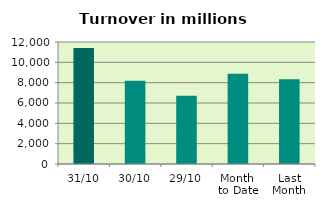
| Category | Series 0 |
|---|---|
| 31/10 | 11421.647 |
| 30/10 | 8200.262 |
| 29/10 | 6719 |
| Month 
to Date | 8866.758 |
| Last
Month | 8346.546 |